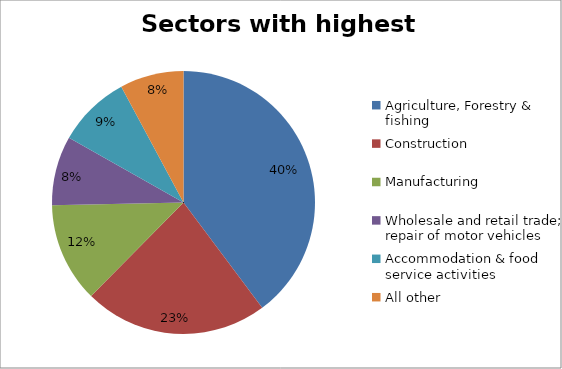
| Category | Sectors with highest totals | Percentage |
|---|---|---|
| Agriculture, Forestry & fishing | 76465 | 0.398 |
| Construction | 43453 | 0.226 |
| Manufacturing | 23586 | 0.123 |
| Wholesale and retail trade; repair of motor vehicles  | 16335 | 0.085 |
| Accommodation & food service activities | 17258 | 0.09 |
| All other | 15070 | 0.078 |